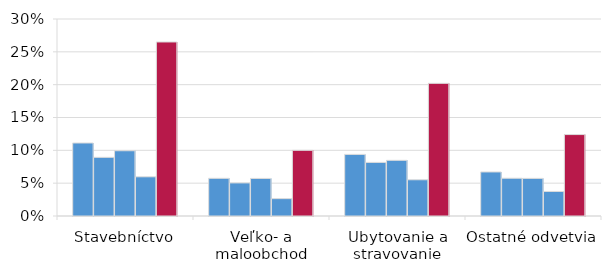
| Category | 2015 | 2016 | 2017 | 2018 | model |
|---|---|---|---|---|---|
| Stavebníctvo | 0.111 | 0.089 | 0.099 | 0.06 | 0.265 |
| Veľko- a maloobchod | 0.057 | 0.05 | 0.057 | 0.026 | 0.1 |
| Ubytovanie a stravovanie | 0.094 | 0.082 | 0.085 | 0.055 | 0.202 |
| Ostatné odvetvia | 0.067 | 0.057 | 0.057 | 0.037 | 0.124 |